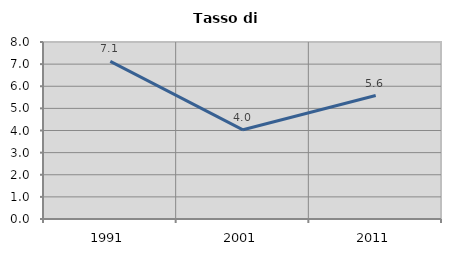
| Category | Tasso di disoccupazione   |
|---|---|
| 1991.0 | 7.128 |
| 2001.0 | 4.032 |
| 2011.0 | 5.58 |